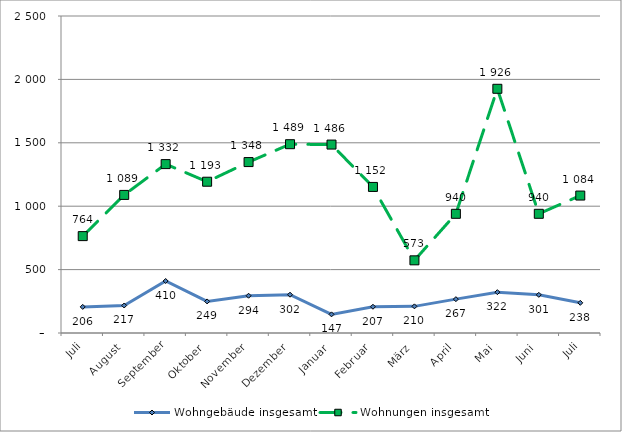
| Category | Wohngebäude insgesamt | Wohnungen insgesamt |
|---|---|---|
| Juli | 206 | 764 |
| August | 217 | 1089 |
| September | 410 | 1332 |
| Oktober | 249 | 1193 |
| November | 294 | 1348 |
| Dezember | 302 | 1489 |
| Januar | 147 | 1486 |
| Februar | 207 | 1152 |
| März | 210 | 573 |
| April | 267 | 940 |
| Mai | 322 | 1926 |
| Juni | 301 | 940 |
| Juli | 238 | 1084 |